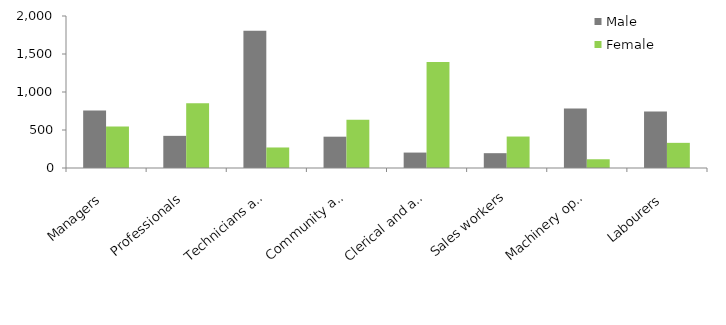
| Category | Male | Female |
|---|---|---|
| Managers | 755 | 546 |
| Professionals | 423 | 852 |
| Technicians and trades workers | 1806 | 270 |
| Community and personal service workers | 412 | 636 |
| Clerical and administrative workers | 203 | 1396 |
| Sales workers | 195 | 414 |
| Machinery operators and drivers | 783 | 115 |
| Labourers | 744 | 331 |